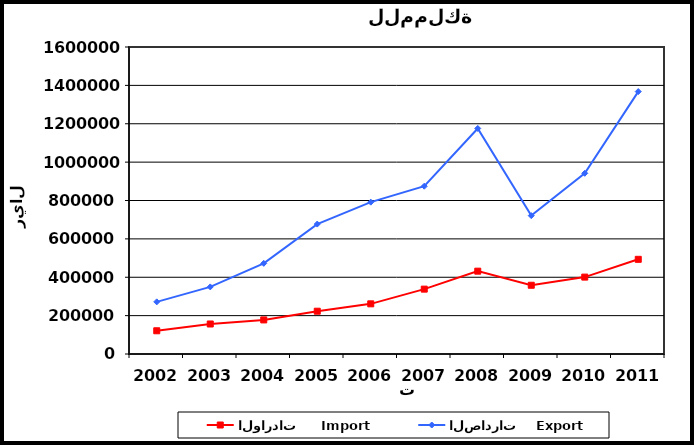
| Category | الواردات     Import | الصادرات    Export |
|---|---|---|
| 2002.0 | 121089 | 271741 |
| 2003.0 | 156391 | 349664 |
| 2004.0 | 177659 | 472491 |
| 2005.0 | 222985 | 677144 |
| 2006.0 | 261402 | 791339 |
| 2007.0 | 338088 | 874403 |
| 2008.0 | 431753 | 1175482 |
| 2009.0 | 358290 | 721109 |
| 2010.0 | 400736 | 941785 |
| 2011.0 | 493449 | 1367620 |